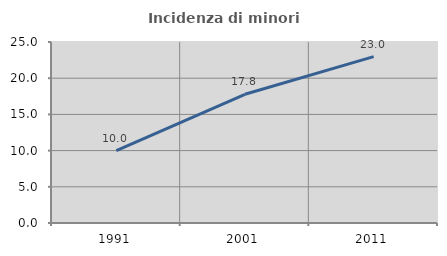
| Category | Incidenza di minori stranieri |
|---|---|
| 1991.0 | 10 |
| 2001.0 | 17.778 |
| 2011.0 | 22.973 |